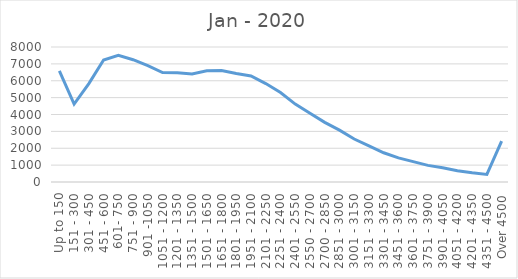
| Category | Jan - 2020 |
|---|---|
| Up to 150 | 6579 |
| 151 - 300 | 4616 |
| 301 - 450 | 5830 |
| 451 - 600 | 7231 |
| 601- 750 | 7502 |
| 751 - 900 | 7248 |
| 901 -1050 | 6895 |
| 1051 - 1200 | 6489 |
| 1201 - 1350 | 6469 |
| 1351 - 1500 | 6396 |
| 1501 - 1650 | 6589 |
| 1651 - 1800 | 6604 |
| 1801 - 1950 | 6427 |
| 1951 - 2100 | 6286 |
| 2101 - 2250 | 5834 |
| 2251 - 2400 | 5305 |
| 2401 - 2550 | 4618 |
| 2550 - 2700 | 4072 |
| 2700 - 2850 | 3536 |
| 2851 - 3000 | 3074 |
| 3001 - 3150 | 2548 |
| 3151 - 3300 | 2143 |
| 3301 - 3450 | 1731 |
| 3451 - 3600 | 1426 |
| 3601 - 3750 | 1206 |
| 3751 - 3900 | 986 |
| 3901 - 4050 | 839 |
| 4051 - 4200 | 669 |
| 4201 - 4350 | 548 |
| 4351 - 4500 | 448 |
| Over 4500 | 2418 |